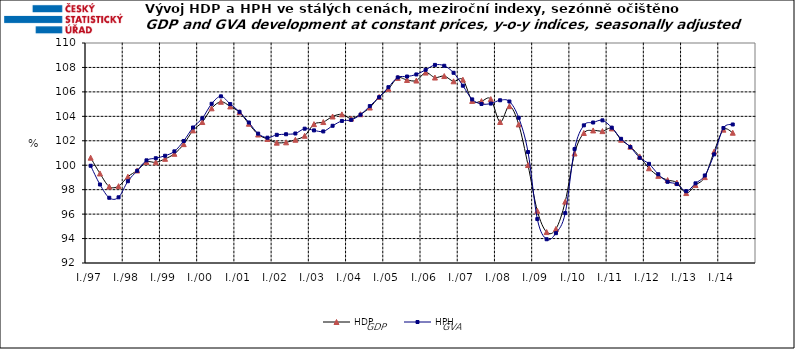
| Category | HDP

 | HPH

 |
|---|---|---|
| I./97 | 100.616 | 99.955 |
|  | 99.326 | 98.423 |
|  | 98.252 | 97.336 |
|  | 98.285 | 97.375 |
| I./98 | 99.06 | 98.689 |
|  | 99.571 | 99.544 |
|  | 100.264 | 100.399 |
|  | 100.237 | 100.572 |
| I./99 | 100.523 | 100.774 |
|  | 100.935 | 101.133 |
|  | 101.726 | 101.985 |
|  | 102.85 | 103.087 |
| I./00 | 103.534 | 103.84 |
|  | 104.655 | 105.026 |
|  | 105.193 | 105.636 |
|  | 104.809 | 105 |
| I./01 | 104.333 | 104.368 |
|  | 103.393 | 103.498 |
|  | 102.512 | 102.587 |
|  | 102.145 | 102.253 |
| I./02 | 101.846 | 102.488 |
|  | 101.874 | 102.535 |
|  | 102.085 | 102.597 |
|  | 102.408 | 102.989 |
| I./03 | 103.362 | 102.85 |
|  | 103.531 | 102.765 |
|  | 103.987 | 103.228 |
|  | 104.162 | 103.624 |
| I./04 | 103.819 | 103.711 |
|  | 104.172 | 104.134 |
|  | 104.72 | 104.837 |
|  | 105.592 | 105.566 |
| I./05 | 106.247 | 106.384 |
|  | 107.143 | 107.186 |
|  | 106.975 | 107.258 |
|  | 106.928 | 107.427 |
| I./06 | 107.58 | 107.805 |
|  | 107.174 | 108.207 |
|  | 107.295 | 108.137 |
|  | 106.866 | 107.563 |
| I./07 | 107.001 | 106.508 |
|  | 105.264 | 105.385 |
|  | 105.246 | 105.012 |
|  | 105.413 | 105.044 |
| I./08 | 103.537 | 105.315 |
|  | 104.833 | 105.214 |
|  | 103.338 | 103.881 |
|  | 100.015 | 101.081 |
| I./09 | 96.269 | 95.595 |
|  | 94.531 | 93.944 |
|  | 94.786 | 94.441 |
|  | 97.02 | 96.083 |
| I./10 | 100.959 | 101.321 |
|  | 102.638 | 103.262 |
|  | 102.845 | 103.495 |
|  | 102.79 | 103.672 |
| I./11 | 103.012 | 103.074 |
|  | 102.088 | 102.16 |
|  | 101.516 | 101.488 |
|  | 100.719 | 100.608 |
| I./12 | 99.751 | 100.113 |
|  | 99.129 | 99.262 |
|  | 98.786 | 98.643 |
|  | 98.578 | 98.458 |
| I./13 | 97.722 | 97.875 |
|  | 98.379 | 98.517 |
|  | 99.027 | 99.163 |
|  | 101.115 | 100.888 |
| I./14 | 102.911 | 103.046 |